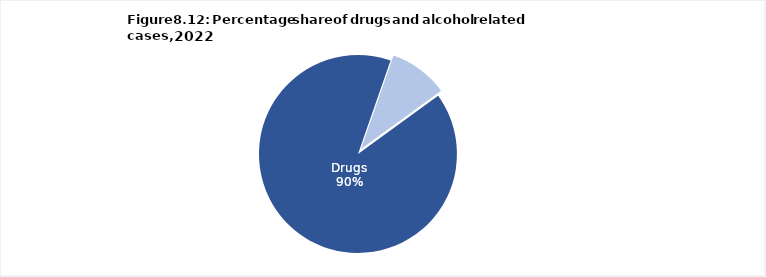
| Category | Series 0 |
|---|---|
| Drugs | 1289 |
| Alcohol | 138 |